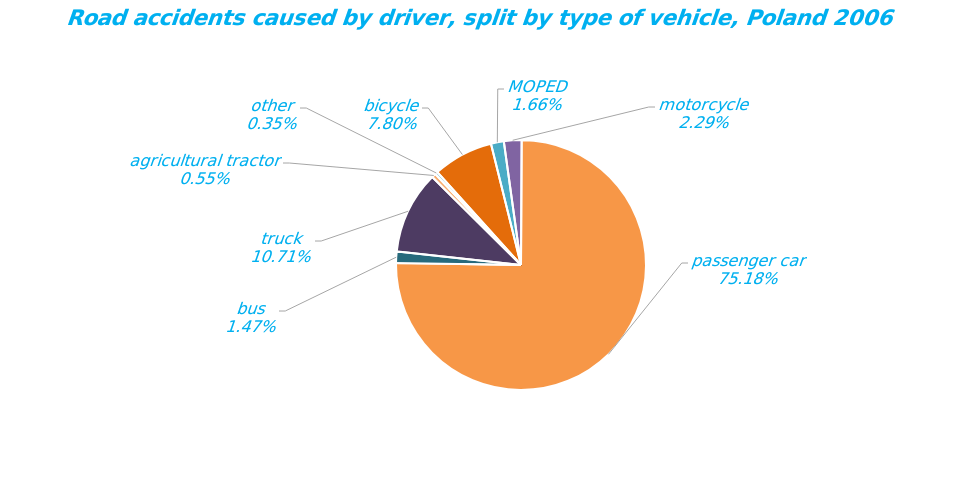
| Category | Series 0 |
|---|---|
| bicycle | 2930 |
| MOPED | 624 |
| motorcycle | 858 |
| passenger car | 28228 |
| bus | 550 |
| truck | 4019 |
| agricultural tractor | 207 |
| other | 132 |